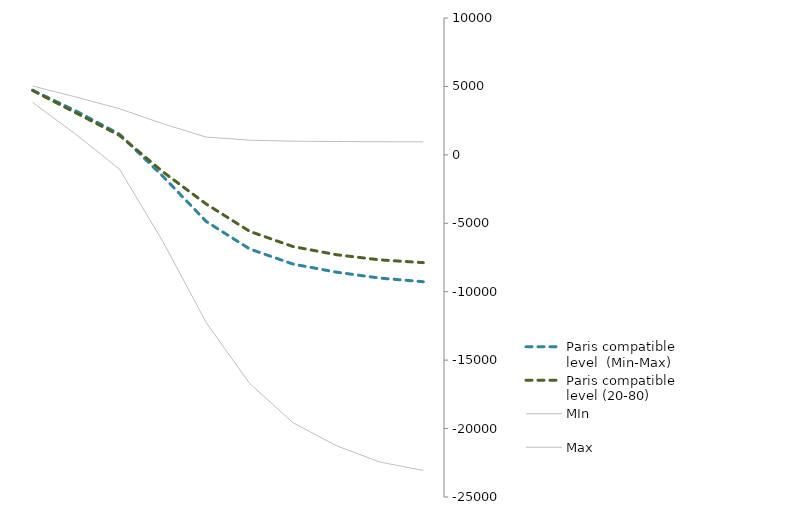
| Category | Paris compatible level  (Min-Max) | Paris compatible level (20-80) | MIn | Max |
|---|---|---|---|---|
| 0 | 4721.388 | 4698.872 | 3826.024 | 5033.205 |
| 1 | 3203.204 | 3061.572 | 1487.312 | 4223.053 |
| 2 | 1512.104 | 1419.353 | -1048.055 | 3371.329 |
| 3 | -1569.181 | -1241.015 | -6334.512 | 2275.16 |
| 4 | -4871.943 | -3595.74 | -12263.891 | 1296.389 |
| 5 | -6876.507 | -5589.883 | -16708.765 | 1073.937 |
| 6 | -7982.272 | -6703.226 | -19578.85 | 997.727 |
| 7 | -8572.191 | -7295.626 | -21255.733 | 974.503 |
| 8 | -9006.116 | -7674.001 | -22446.983 | 960.64 |
| 9 | -9269.889 | -7875.404 | -23059.848 | 948.685 |